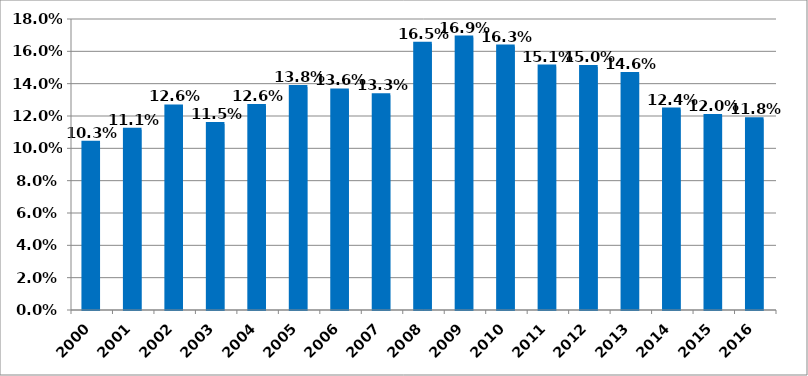
| Category | უმუშევრობა სულ |
|---|---|
| 2000.0 | 0.103 |
| 2001.0 | 0.111 |
| 2002.0 | 0.126 |
| 2003.0 | 0.115 |
| 2004.0 | 0.126 |
| 2005.0 | 0.138 |
| 2006.0 | 0.136 |
| 2007.0 | 0.133 |
| 2008.0 | 0.165 |
| 2009.0 | 0.169 |
| 2010.0 | 0.163 |
| 2011.0 | 0.151 |
| 2012.0 | 0.15 |
| 2013.0 | 0.146 |
| 2014.0 | 0.124 |
| 2015.0 | 0.12 |
| 2016.0 | 0.118 |